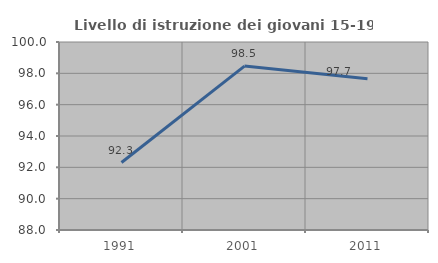
| Category | Livello di istruzione dei giovani 15-19 anni |
|---|---|
| 1991.0 | 92.308 |
| 2001.0 | 98.462 |
| 2011.0 | 97.661 |